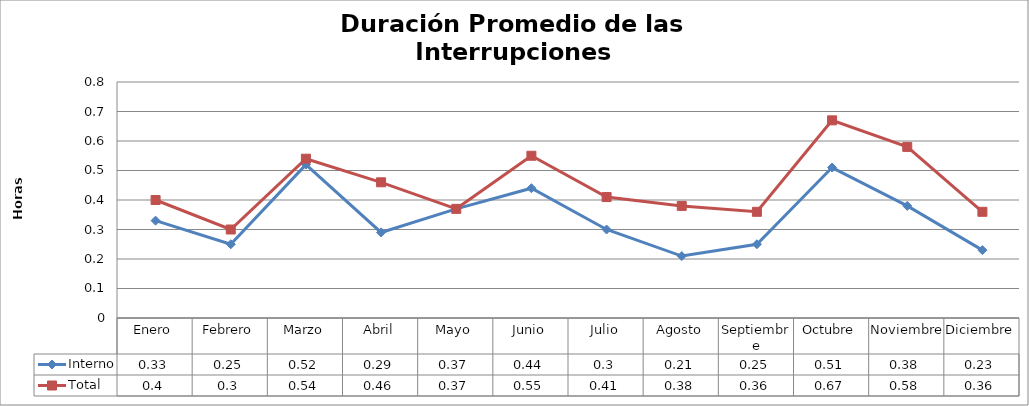
| Category | Interno | Total |
|---|---|---|
| Enero | 0.33 | 0.4 |
| Febrero | 0.25 | 0.3 |
| Marzo | 0.52 | 0.54 |
| Abril | 0.29 | 0.46 |
| Mayo | 0.37 | 0.37 |
| Junio | 0.44 | 0.55 |
| Julio | 0.3 | 0.41 |
| Agosto | 0.21 | 0.38 |
| Septiembre | 0.25 | 0.36 |
| Octubre | 0.51 | 0.67 |
| Noviembre | 0.38 | 0.58 |
| Diciembre | 0.23 | 0.36 |